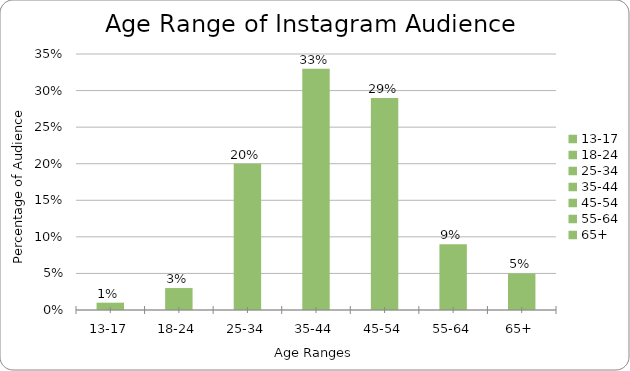
| Category | Series 0 |
|---|---|
| 13-17 | 0.01 |
| 18-24 | 0.03 |
| 25-34 | 0.2 |
| 35-44 | 0.33 |
| 45-54 | 0.29 |
| 55-64 | 0.09 |
| 65+ | 0.05 |